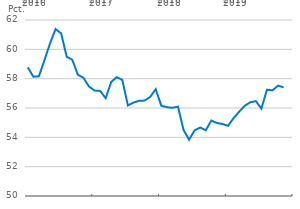
| Category | Udlandets ejerandel af C25 |
|---|---|
| 2016-01-01 | 58.775 |
| 2016-02-01 | 58.135 |
| 2016-03-01 | 58.161 |
| 2016-04-01 | 59.263 |
| 2016-05-01 | 60.404 |
| 2016-06-01 | 61.383 |
| 2016-07-01 | 61.084 |
| 2016-08-01 | 59.49 |
| 2016-09-01 | 59.29 |
| 2016-10-01 | 58.269 |
| 2016-11-01 | 58.064 |
| 2016-12-01 | 57.469 |
| 2017-01-01 | 57.19 |
| 2017-02-01 | 57.167 |
| 2017-03-01 | 56.672 |
| 2017-04-01 | 57.774 |
| 2017-05-01 | 58.104 |
| 2017-06-01 | 57.908 |
| 2017-07-01 | 56.172 |
| 2017-08-01 | 56.37 |
| 2017-09-01 | 56.489 |
| 2017-10-01 | 56.506 |
| 2017-11-01 | 56.752 |
| 2017-12-01 | 57.282 |
| 2018-01-01 | 56.158 |
| 2018-02-01 | 56.057 |
| 2018-03-01 | 56.012 |
| 2018-04-01 | 56.094 |
| 2018-05-01 | 54.504 |
| 2018-06-01 | 53.841 |
| 2018-07-01 | 54.481 |
| 2018-08-01 | 54.668 |
| 2018-09-01 | 54.481 |
| 2018-10-01 | 55.144 |
| 2018-11-01 | 54.978 |
| 2018-12-01 | 54.91 |
| 2019-01-01 | 54.786 |
| 2019-02-01 | 55.308 |
| 2019-03-01 | 55.747 |
| 2019-04-01 | 56.152 |
| 2019-05-01 | 56.387 |
| 2019-06-01 | 56.467 |
| 2019-07-01 | 55.957 |
| 2019-08-01 | 57.245 |
| 2019-09-01 | 57.202 |
| 2019-10-01 | 57.526 |
| 2019-11-01 | 57.406 |